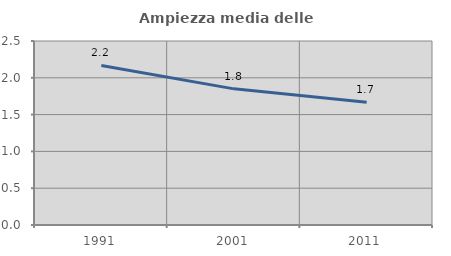
| Category | Ampiezza media delle famiglie |
|---|---|
| 1991.0 | 2.168 |
| 2001.0 | 1.85 |
| 2011.0 | 1.667 |